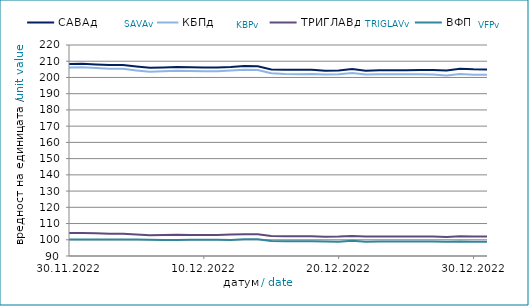
| Category | САВАд | КБПд | ТРИГЛАВд | ВФПд |
|---|---|---|---|---|
| 2022-11-30 | 208.261 | 206.099 | 104.155 | 100.153 |
| 2022-12-01 | 208.487 | 206.254 | 104.221 | 100.152 |
| 2022-12-02 | 208.031 | 205.781 | 103.98 | 100.151 |
| 2022-12-03 | 207.637 | 205.314 | 103.753 | 100.149 |
| 2022-12-04 | 207.643 | 205.32 | 103.757 | 100.148 |
| 2022-12-05 | 206.792 | 204.359 | 103.264 | 100.144 |
| 2022-12-06 | 205.953 | 203.49 | 102.806 | 100.032 |
| 2022-12-07 | 206.183 | 203.813 | 102.946 | 99.835 |
| 2022-12-08 | 206.393 | 204.11 | 103.094 | 99.88 |
| 2022-12-09 | 206.221 | 203.923 | 102.947 | 100.033 |
| 2022-12-10 | 206.124 | 203.802 | 102.885 | 100.024 |
| 2022-12-11 | 206.131 | 203.808 | 102.889 | 100.026 |
| 2022-12-12 | 206.447 | 204.264 | 103.199 | 99.91 |
| 2022-12-13 | 207.032 | 204.756 | 103.414 | 100.389 |
| 2022-12-14 | 206.905 | 204.642 | 103.354 | 100.34 |
| 2022-12-15 | 204.928 | 202.604 | 102.389 | 99.29 |
| 2022-12-16 | 204.714 | 202.088 | 102.122 | 99.022 |
| 2022-12-17 | 204.678 | 202.053 | 102.111 | 99.011 |
| 2022-12-18 | 204.685 | 202.06 | 102.115 | 99.013 |
| 2022-12-19 | 204.16 | 201.785 | 101.918 | 98.923 |
| 2022-12-20 | 204.36 | 201.949 | 102.015 | 98.812 |
| 2022-12-21 | 205.182 | 202.671 | 102.378 | 99.318 |
| 2022-12-22 | 204.21 | 201.758 | 101.964 | 98.852 |
| 2022-12-23 | 204.388 | 201.947 | 102.054 | 98.928 |
| 2022-12-24 | 204.372 | 201.936 | 102.057 | 98.916 |
| 2022-12-25 | 204.378 | 201.943 | 102.061 | 98.918 |
| 2022-12-26 | 204.535 | 201.929 | 102.062 | 98.908 |
| 2022-12-27 | 204.583 | 201.836 | 102.012 | 98.904 |
| 2022-12-28 | 204.322 | 201.187 | 101.699 | 98.754 |
| 2022-12-29 | 205.343 | 202.077 | 102.093 | 98.957 |
| 2022-12-30 | 205.01 | 201.68 | 101.98 | 98.795 |
| 2022-12-31 | 204.936 | 201.601 | 101.945 | 98.792 |